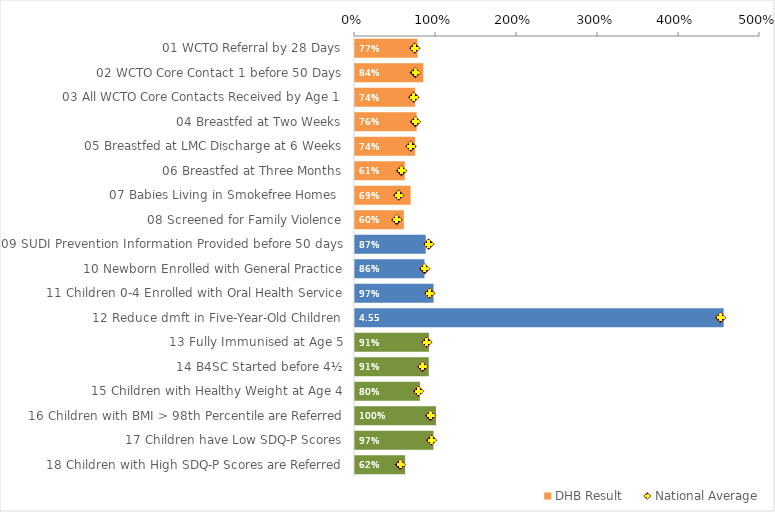
| Category | DHB Result |
|---|---|
| 01 WCTO Referral by 28 Days | 0.772 |
| 02 WCTO Core Contact 1 before 50 Days | 0.844 |
| 03 All WCTO Core Contacts Received by Age 1 | 0.741 |
| 04 Breastfed at Two Weeks | 0.761 |
| 05 Breastfed at LMC Discharge at 6 Weeks | 0.742 |
| 06 Breastfed at Three Months | 0.614 |
| 07 Babies Living in Smokefree Homes  | 0.686 |
| 08 Screened for Family Violence | 0.602 |
| 09 SUDI Prevention Information Provided before 50 days | 0.873 |
| 10 Newborn Enrolled with General Practice | 0.857 |
| 11 Children 0-4 Enrolled with Oral Health Service | 0.97 |
| 12 Reduce dmft in Five-Year-Old Children | 4.551 |
| 13 Fully Immunised at Age 5 | 0.912 |
| 14 B4SC Started before 4½ | 0.911 |
| 15 Children with Healthy Weight at Age 4 | 0.801 |
| 16 Children with BMI > 98th Percentile are Referred | 1 |
| 17 Children have Low SDQ-P Scores | 0.969 |
| 18 Children with High SDQ-P Scores are Referred | 0.619 |